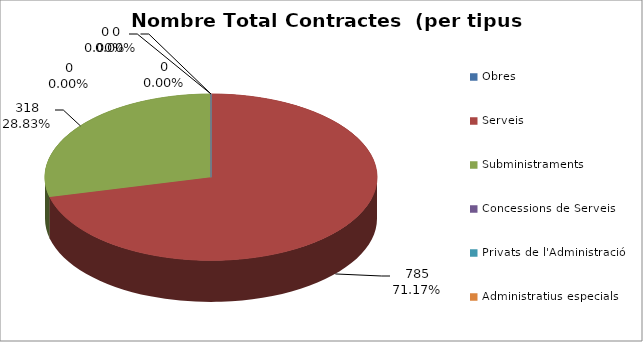
| Category | Nombre Total Contractes |
|---|---|
| Obres | 0 |
| Serveis | 785 |
| Subministraments | 318 |
| Concessions de Serveis | 0 |
| Privats de l'Administració | 0 |
| Administratius especials | 0 |